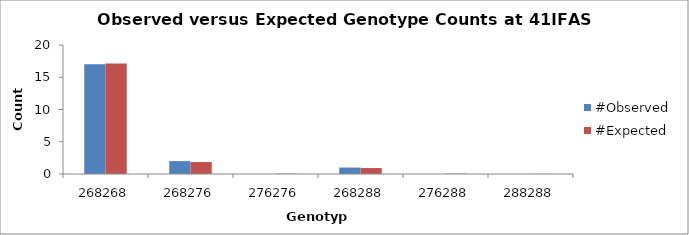
| Category | #Observed | #Expected |
|---|---|---|
| 268268.0 | 17 | 17.112 |
| 268276.0 | 2 | 1.85 |
| 276276.0 | 0 | 0.05 |
| 268288.0 | 1 | 0.925 |
| 276288.0 | 0 | 0.05 |
| 288288.0 | 0 | 0.012 |